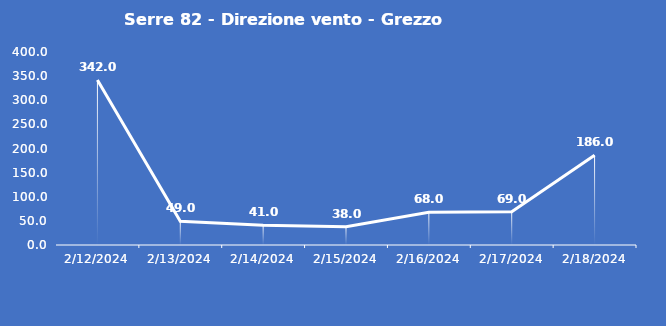
| Category | Serre 82 - Direzione vento - Grezzo (°N) |
|---|---|
| 2/12/24 | 342 |
| 2/13/24 | 49 |
| 2/14/24 | 41 |
| 2/15/24 | 38 |
| 2/16/24 | 68 |
| 2/17/24 | 69 |
| 2/18/24 | 186 |